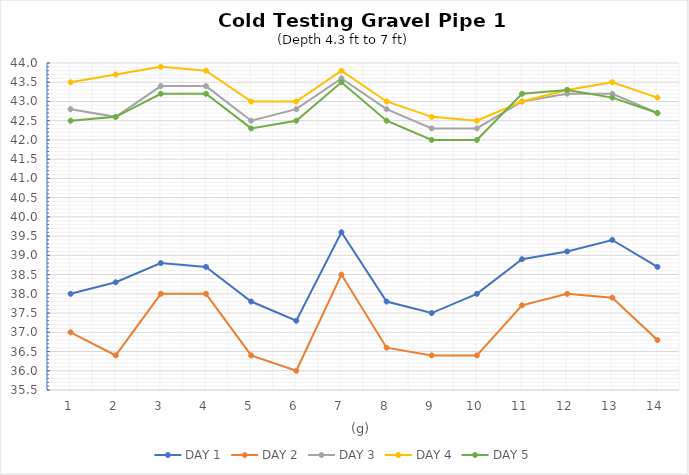
| Category | DAY 1 | DAY 2 | DAY 3 | DAY 4 | DAY 5 |
|---|---|---|---|---|---|
| 0 | 38 | 37 | 42.8 | 43.5 | 42.5 |
| 1 | 38.3 | 36.4 | 42.6 | 43.7 | 42.6 |
| 2 | 38.8 | 38 | 43.4 | 43.9 | 43.2 |
| 3 | 38.7 | 38 | 43.4 | 43.8 | 43.2 |
| 4 | 37.8 | 36.4 | 42.5 | 43 | 42.3 |
| 5 | 37.3 | 36 | 42.8 | 43 | 42.5 |
| 6 | 39.6 | 38.5 | 43.6 | 43.8 | 43.5 |
| 7 | 37.8 | 36.6 | 42.8 | 43 | 42.5 |
| 8 | 37.5 | 36.4 | 42.3 | 42.6 | 42 |
| 9 | 38 | 36.4 | 42.3 | 42.5 | 42 |
| 10 | 38.9 | 37.7 | 43 | 43 | 43.2 |
| 11 | 39.1 | 38 | 43.2 | 43.3 | 43.3 |
| 12 | 39.4 | 37.9 | 43.2 | 43.5 | 43.1 |
| 13 | 38.7 | 36.8 | 42.7 | 43.1 | 42.7 |